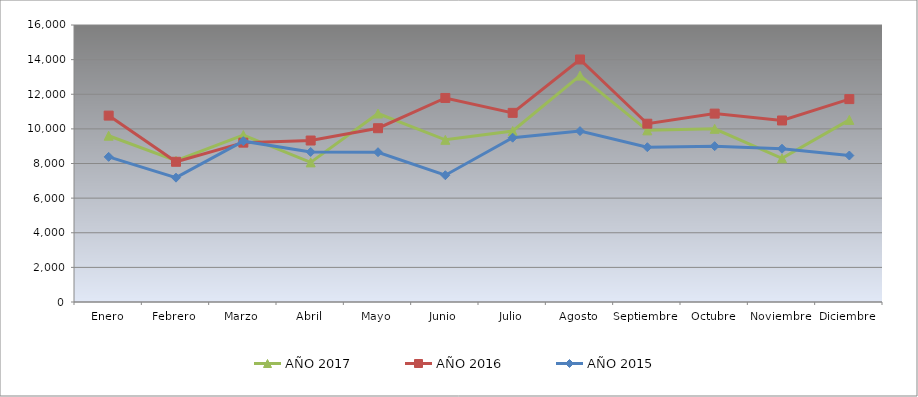
| Category | AÑO 2017 | AÑO 2016 | AÑO 2015 |
|---|---|---|---|
| Enero | 9604.441 | 10767.016 | 8383.78 |
| Febrero | 8161.547 | 8098.754 | 7181.533 |
| Marzo | 9646.154 | 9204.82 | 9290.93 |
| Abril | 8064.848 | 9327.173 | 8666.266 |
| Mayo | 10886.17 | 10038.774 | 8651.973 |
| Junio | 9368.383 | 11785.968 | 7322.776 |
| Julio | 9876.524 | 10925.585 | 9490.183 |
| Agosto | 13077.056 | 14008.867 | 9871.035 |
| Septiembre | 9914.445 | 10298.162 | 8941.185 |
| Octubre | 10003.559 | 10881.538 | 9002.558 |
| Noviembre | 8299.958 | 10485.116 | 8852.067 |
| Diciembre | 10519.285 | 11719.408 | 8461.127 |